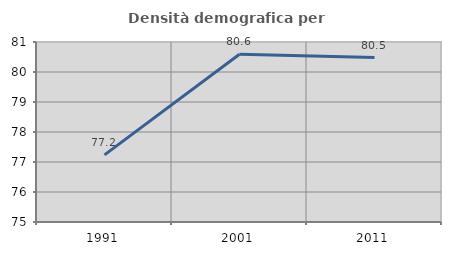
| Category | Densità demografica |
|---|---|
| 1991.0 | 77.239 |
| 2001.0 | 80.594 |
| 2011.0 | 80.481 |